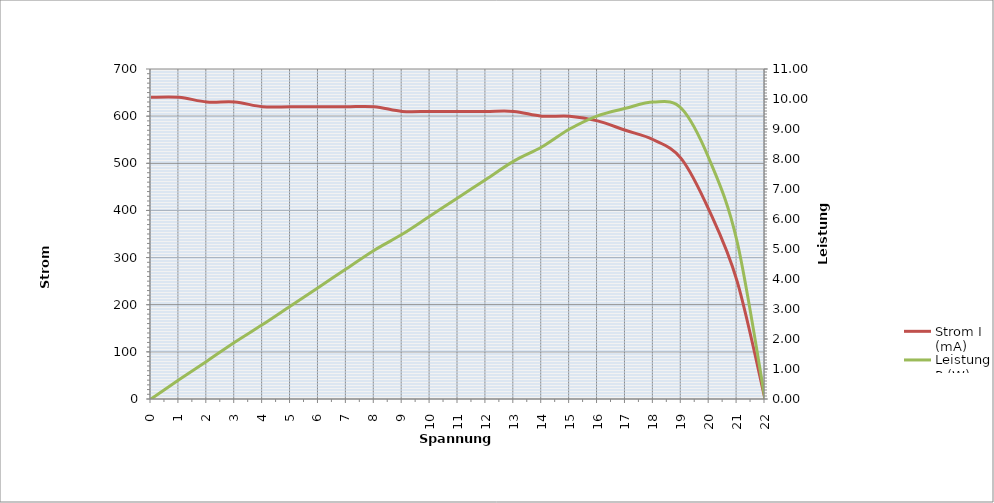
| Category | Strom I (mA) |
|---|---|
| 0.0 | 640 |
| 1.0 | 640 |
| 2.0 | 630 |
| 3.0 | 630 |
| 4.0 | 620 |
| 5.0 | 620 |
| 6.0 | 620 |
| 7.0 | 620 |
| 8.0 | 620 |
| 9.0 | 610 |
| 10.0 | 610 |
| 11.0 | 610 |
| 12.0 | 610 |
| 13.0 | 610 |
| 14.0 | 600 |
| 15.0 | 600 |
| 16.0 | 590 |
| 17.0 | 570 |
| 18.0 | 550 |
| 19.0 | 510 |
| 20.0 | 400 |
| 21.0 | 250 |
| 22.0 | 0 |